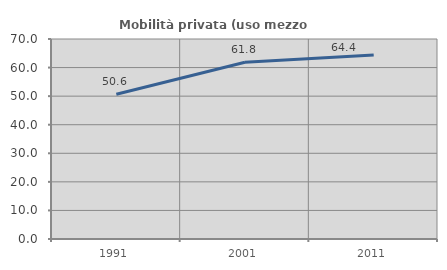
| Category | Mobilità privata (uso mezzo privato) |
|---|---|
| 1991.0 | 50.638 |
| 2001.0 | 61.836 |
| 2011.0 | 64.431 |